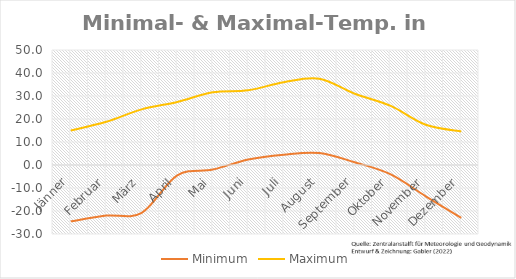
| Category | Minimum | Maximum |
|---|---|---|
| Jänner | -24.5 | 15 |
| Februar | -22 | 18.8 |
| März | -20.8 | 24.2 |
| April | -4.5 | 27.4 |
| Mai | -2 | 31.6 |
| Juni | 2.4 | 32.5 |
| Juli | 4.5 | 36 |
| August | 5.2 | 37.5 |
| September | 1.2 | 31 |
| Oktober | -4 | 25.8 |
| November | -13.6 | 17.5 |
| Dezember | -23 | 14.6 |